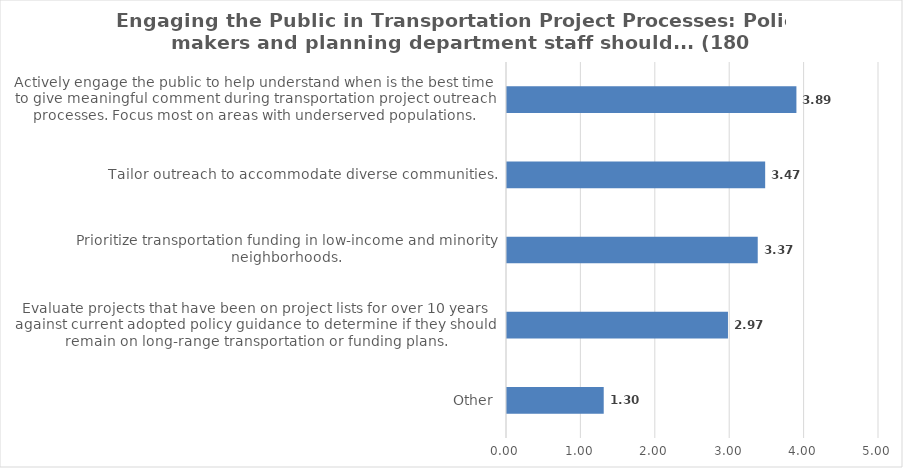
| Category | Score |
|---|---|
| Other | 1.3 |
| Evaluate projects that have been on project lists for over 10 years against current adopted policy guidance to determine if they should remain on long-range transportation or funding plans. | 2.97 |
| Prioritize transportation funding in low-income and minority neighborhoods. | 3.37 |
| Tailor outreach to accommodate diverse communities. | 3.47 |
| Actively engage the public to help understand when is the best time to give meaningful comment during transportation project outreach processes. Focus most on areas with underserved populations. | 3.89 |